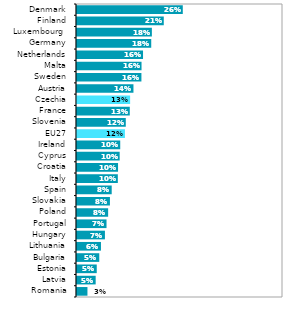
| Category | Series 1 |
|---|---|
| Romania | 0.025 |
| Latvia | 0.045 |
| Estonia | 0.048 |
| Bulgaria | 0.054 |
| Lithuania | 0.058 |
| Hungary | 0.068 |
| Portugal | 0.072 |
| Poland | 0.076 |
| Slovakia | 0.08 |
| Spain | 0.084 |
| Italy | 0.099 |
| Croatia | 0.1 |
| Cyprus | 0.104 |
| Ireland | 0.105 |
|  EU27 | 0.116 |
| Slovenia | 0.118 |
| France | 0.128 |
| Czechia | 0.129 |
| Austria | 0.137 |
| Sweden | 0.156 |
| Malta | 0.157 |
| Netherlands | 0.16 |
| Germany | 0.18 |
| Luxembourg  | 0.182 |
| Finland | 0.211 |
| Denmark | 0.257 |